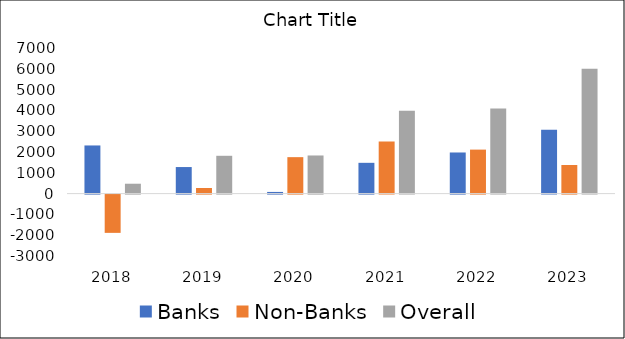
| Category | Banks | Non-Banks | Overall |
|---|---|---|---|
| 2018.0 | 2314.648 | -1839.873 | 474.78 |
| 2019.0 | 1276.592 | 270.579 | 1817.749 |
| 2020.0 | 80.106 | 1752.433 | 1832.539 |
| 2021.0 | 1479.639 | 2508.404 | 3988.043 |
| 2022.0 | 1976.641 | 2114.935 | 4091.576 |
| 2023.0 | 3069.619 | 1374.231 | 6007.938 |